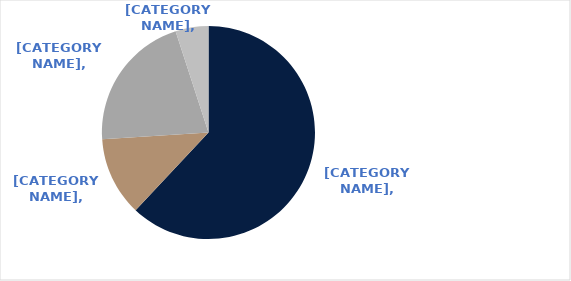
| Category | Series 0 |
|---|---|
| Office | 0.62 |
| Industrial | 0.12 |
| Retail | 0.21 |
| Build to Rent | 0.05 |